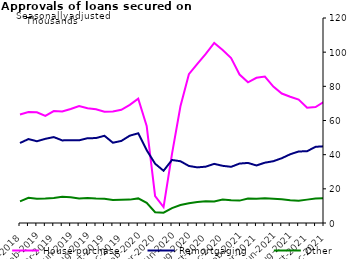
| Category | House purchase | Remortgaging | Other |
|---|---|---|---|
| Dec-2018 | 63555 | 46830 | 12675 |
| Jan-2019 | 64922 | 49131 | 14737 |
| Feb-2019 | 64767 | 47862 | 14208 |
| Mar-2019 | 62648 | 49273 | 14292 |
| Apr-2019 | 65492 | 50297 | 14690 |
| May-2019 | 65224 | 48355 | 15315 |
| Jun-2019 | 66720 | 48422 | 15072 |
| Jul-2019 | 68525 | 48418 | 14328 |
| Aug-2019 | 67213 | 49621 | 14633 |
| Sep-2019 | 66548 | 49711 | 14285 |
| Oct-2019 | 65106 | 51064 | 14186 |
| Nov-2019 | 65236 | 46991 | 13430 |
| Dec-2019 | 66273 | 48036 | 13654 |
| Jan-2020 | 69147 | 51121 | 13689 |
| Feb-2020 | 72737 | 52510 | 14408 |
| Mar-2020 | 56833 | 42631 | 11813 |
| Apr-2020 | 15770 | 34710 | 6313 |
| May-2020 | 9279 | 30584 | 6043 |
| Jun-2020 | 40464 | 36890 | 8714 |
| Jul-2020 | 68332 | 36152 | 10492 |
| Aug-2020 | 87135 | 33396 | 11590 |
| Sep-2020 | 93148 | 32552 | 12354 |
| Oct-2020 | 98985 | 32985 | 12661 |
| Nov-2020 | 105365 | 34614 | 12573 |
| Dec-2020 | 101238 | 33469 | 13767 |
| Jan-2021 | 96579 | 32884 | 13265 |
| Feb-2021 | 86913 | 34788 | 13109 |
| Mar-2021 | 82347 | 35163 | 14287 |
| Apr-2021 | 84974 | 33678 | 14184 |
| May-2021 | 85752 | 35309 | 14482 |
| Jun-2021 | 79837 | 36170 | 14164 |
| Jul-2021 | 75796 | 37926 | 13861 |
| Aug-2021 | 73918 | 40232 | 13347 |
| Sep-2021 | 72267 | 41862 | 13019 |
| Oct-2021 | 67455 | 42021 | 13685 |
| Nov-2021 | 67859 | 44609 | 14349 |
| Dec-2021 | 71015 | 44900 | 14584 |